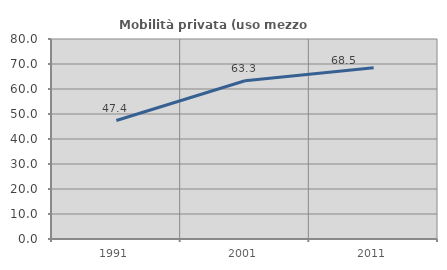
| Category | Mobilità privata (uso mezzo privato) |
|---|---|
| 1991.0 | 47.4 |
| 2001.0 | 63.285 |
| 2011.0 | 68.481 |